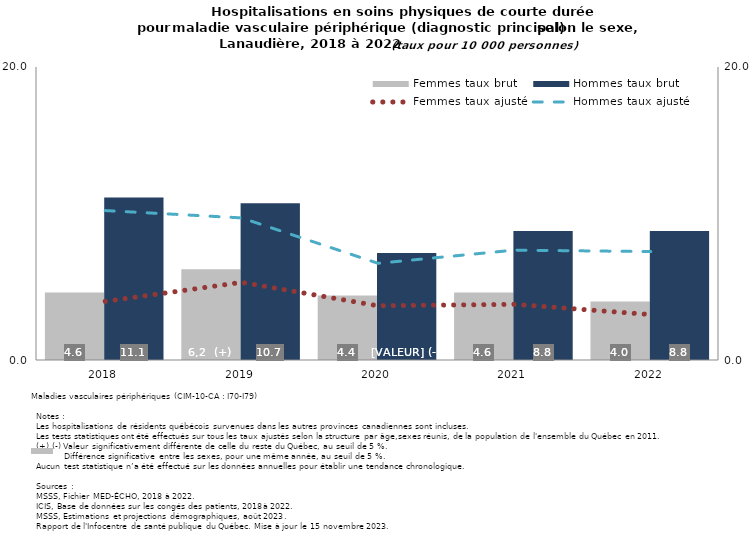
| Category | Femmes taux brut | Hommes taux brut |
|---|---|---|
| 2018.0 | 4.6 | 11.1 |
| 2019.0 | 6.2 | 10.7 |
| 2020.0 | 4.4 | 7.3 |
| 2021.0 | 4.6 | 8.8 |
| 2022.0 | 4 | 8.8 |